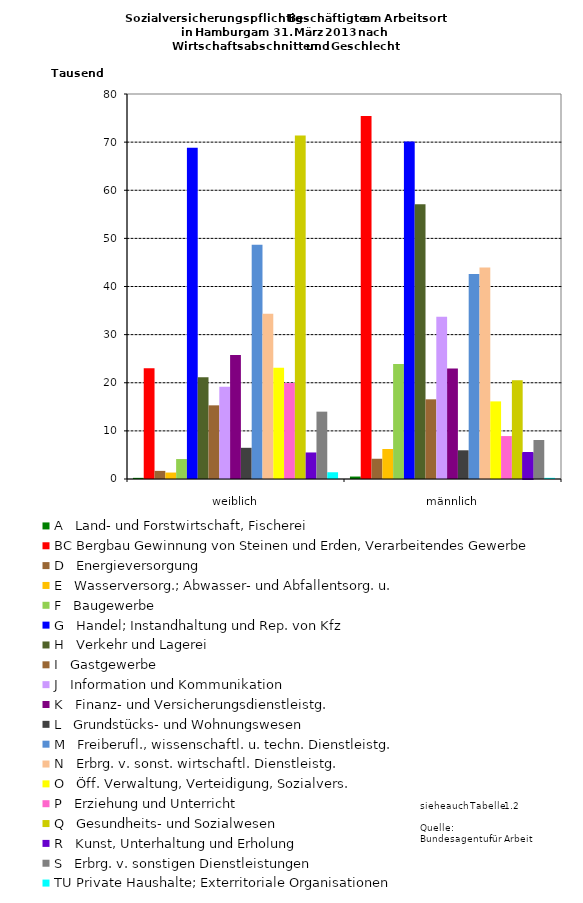
| Category | A   Land- und Forstwirtschaft, Fischerei | BC Bergbau Gewinnung von Steinen und Erden, Verarbeitendes Gewerbe | D   Energieversorgung | E   Wasserversorg.; Abwasser- und Abfallentsorg. u. | F   Baugewerbe | G   Handel; Instandhaltung und Rep. von Kfz | H   Verkehr und Lagerei | I   Gastgewerbe | J   Information und Kommunikation | K   Finanz- und Versicherungsdienstleistg. | L   Grundstücks- und Wohnungswesen | M   Freiberufl., wissenschaftl. u. techn. Dienstleistg. | N   Erbrg. v. sonst. wirtschaftl. Dienstleistg. | O   Öff. Verwaltung, Verteidigung, Sozialvers. | P   Erziehung und Unterricht | Q   Gesundheits- und Sozialwesen | R   Kunst, Unterhaltung und Erholung | S   Erbrg. v. sonstigen Dienstleistungen | TU Private Haushalte; Exterritoriale Organisationen |
|---|---|---|---|---|---|---|---|---|---|---|---|---|---|---|---|---|---|---|---|
| weiblich | 239 | 23027 | 1686 | 1342 | 4146 | 68820 | 21147 | 15306 | 19170 | 25745 | 6483 | 48670 | 34334 | 23112 | 19926 | 71389 | 5514 | 13996 | 1402 |
| männlich | 510 | 75416 | 4208 | 6230 | 23919 | 70113 | 57099 | 16556 | 33734 | 22963 | 5967 | 42617 | 43946 | 16127 | 8920 | 20506 | 5504 | 8102 | 241 |